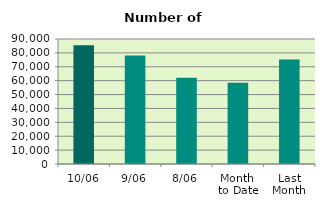
| Category | Series 0 |
|---|---|
| 10/06 | 85558 |
| 9/06 | 78084 |
| 8/06 | 62094 |
| Month 
to Date | 58559.25 |
| Last
Month | 75261.143 |